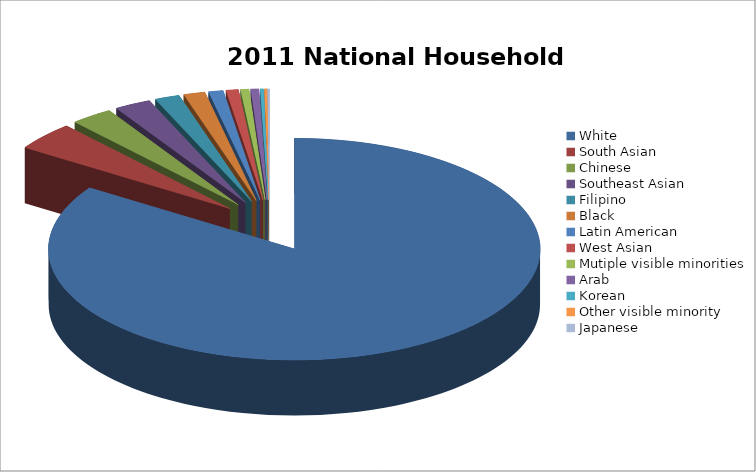
| Category | Series 0 | Series 1 |
|---|---|---|
| White | 101630 | 84.3 |
| South Asian | 4970 | 4.1 |
| Chinese | 3350 | 2.8 |
| Southeast Asian | 2890 | 2.4 |
| Filipino | 1960 | 1.6 |
| Black | 1695 | 1.4 |
| Latin American | 1150 | 1 |
| West Asian | 975 | 0.8 |
| Mutiple visible minorities | 655 | 0.5 |
| Arab | 640 | 0.5 |
| Korean | 280 | 0.2 |
| Other visible minority | 205 | 0.2 |
| Japanese | 145 | 0.1 |